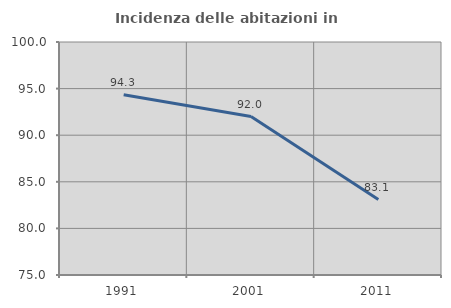
| Category | Incidenza delle abitazioni in proprietà  |
|---|---|
| 1991.0 | 94.34 |
| 2001.0 | 92 |
| 2011.0 | 83.099 |